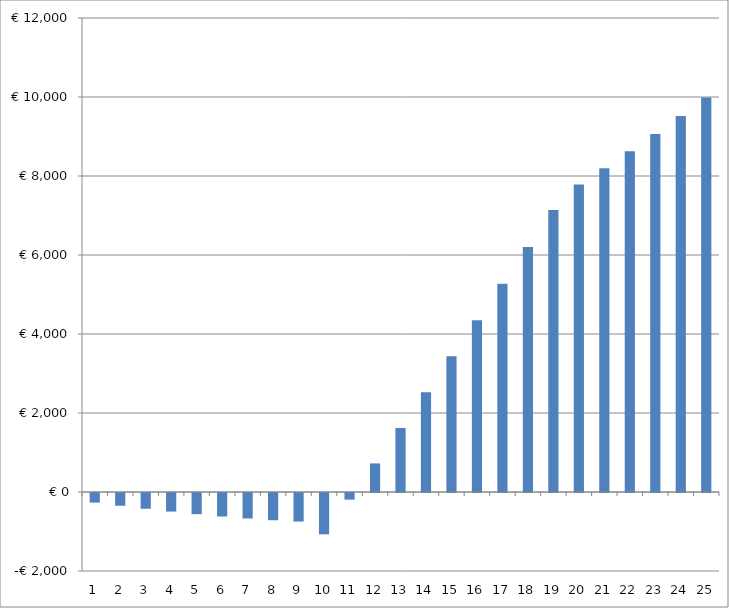
| Category | Series 0 |
|---|---|
| 0 | -242.575 |
| 1 | -322.748 |
| 2 | -398.796 |
| 3 | -469.962 |
| 4 | -535.448 |
| 5 | -594.415 |
| 6 | -645.977 |
| 7 | -689.204 |
| 8 | -723.116 |
| 9 | -1046.679 |
| 10 | -167.856 |
| 11 | 723.552 |
| 12 | 1621.597 |
| 13 | 2525.245 |
| 14 | 3434.821 |
| 15 | 4350.655 |
| 16 | 5273.086 |
| 17 | 6202.459 |
| 18 | 7139.126 |
| 19 | 7783.449 |
| 20 | 8197.358 |
| 21 | 8624.511 |
| 22 | 9065.249 |
| 23 | 9519.919 |
| 24 | 9988.881 |